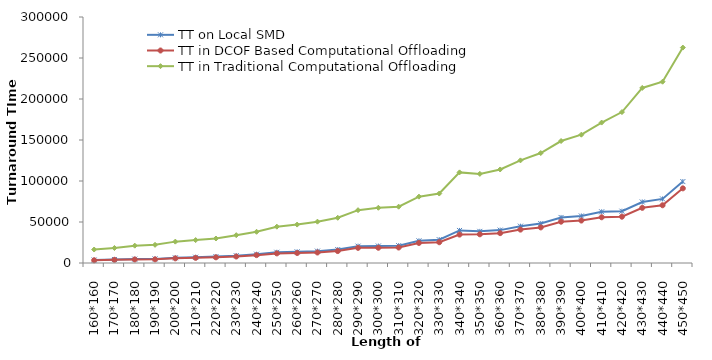
| Category | TT on Local SMD   | TT in DCOF Based Computational Offloading | TT in Traditional Computational Offloading  |
|---|---|---|---|
| 160*160 | 3653 | 3294 | 16431 |
| 170*170 | 4276 | 3889 | 18296 |
| 180*180 | 4781 | 4308 | 21132 |
| 190*190 | 5030 | 4451 | 22170 |
| 200*200 | 6321 | 5661 | 26061 |
| 210*210 | 7039 | 6287 | 27927 |
| 220*220 | 7777 | 6929 | 29878 |
| 230*230 | 8888 | 7916 | 33920 |
| 240*240 | 10735 | 9589 | 38052 |
| 250*250 | 13090 | 11724 | 44310 |
| 260*260 | 13642 | 12177 | 46841 |
| 270*270 | 14471 | 12805 | 50412 |
| 280*280 | 16411 | 14546 | 55178 |
| 290*290 | 20524 | 18448 | 64414 |
| 300*300 | 20706 | 18599 | 67346 |
| 310*310 | 21185 | 18883 | 68692 |
| 320*320 | 27028 | 24444 | 80922 |
| 330*330 | 28452 | 25317 | 84709 |
| 340*340 | 39691 | 34666 | 110506 |
| 350*350 | 38570 | 35016 | 108677 |
| 360*360 | 40096 | 36406 | 114062 |
| 370*370 | 44896 | 40720 | 125149 |
| 380*380 | 48088 | 43402 | 134100 |
| 390*390 | 55560 | 50381 | 148747 |
| 400*400 | 57339 | 51775 | 156489 |
| 410*410 | 62405 | 55762 | 171252 |
| 420*420 | 63159 | 56467 | 184056 |
| 430*430 | 74424 | 67278 | 213507 |
| 440*440 | 78163 | 70400 | 221092 |
| 450*450 | 99286 | 91038 | 262697 |